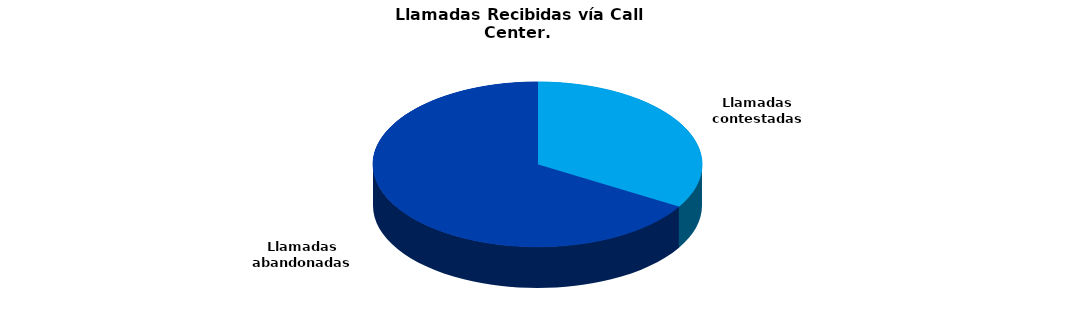
| Category | Enero-Diciembre | Series 1 |
|---|---|---|
| Llamadas contestadas | 225032 |  |
| Llamadas abandonadas | 445236 |  |